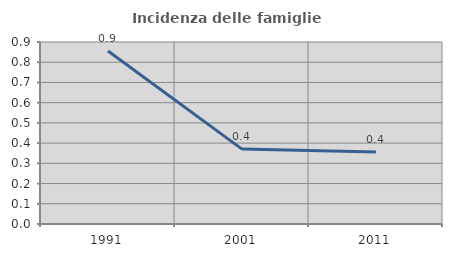
| Category | Incidenza delle famiglie numerose |
|---|---|
| 1991.0 | 0.855 |
| 2001.0 | 0.37 |
| 2011.0 | 0.356 |